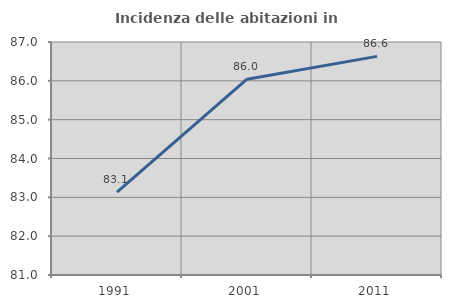
| Category | Incidenza delle abitazioni in proprietà  |
|---|---|
| 1991.0 | 83.133 |
| 2001.0 | 86.042 |
| 2011.0 | 86.63 |